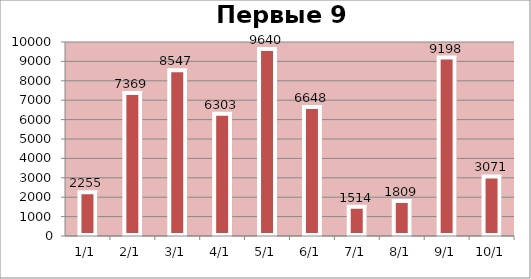
| Category | Сумма |
|---|---|
| 2010-01-01 | 2255 |
| 2010-01-02 | 7369 |
| 2010-01-03 | 8547 |
| 2010-01-04 | 6303 |
| 2010-01-05 | 9640 |
| 2010-01-06 | 6648 |
| 2010-01-07 | 1514 |
| 2010-01-08 | 1809 |
| 2010-01-09 | 9198 |